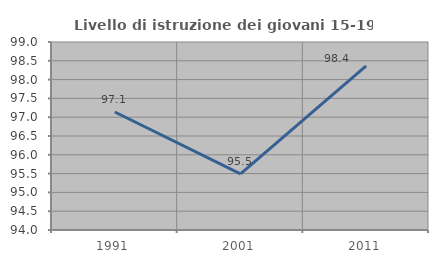
| Category | Livello di istruzione dei giovani 15-19 anni |
|---|---|
| 1991.0 | 97.139 |
| 2001.0 | 95.491 |
| 2011.0 | 98.368 |